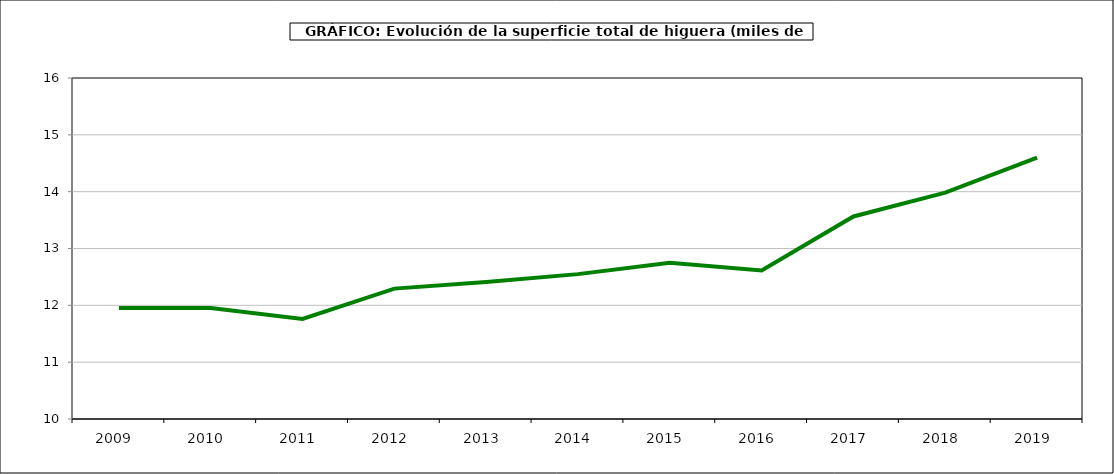
| Category | superficie higuera |
|---|---|
| 2009.0 | 11.953 |
| 2010.0 | 11.953 |
| 2011.0 | 11.761 |
| 2012.0 | 12.294 |
| 2013.0 | 12.411 |
| 2014.0 | 12.549 |
| 2015.0 | 12.751 |
| 2016.0 | 12.613 |
| 2017.0 | 13.564 |
| 2018.0 | 13.983 |
| 2019.0 | 14.599 |